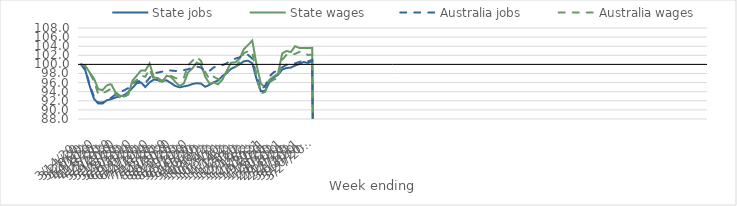
| Category | State jobs | State wages | Australia jobs | Australia wages |
|---|---|---|---|---|
| 14/03/2020 | 100 | 100 | 100 | 100 |
| 21/03/2020 | 98.646 | 99.646 | 98.97 | 99.607 |
| 28/03/2020 | 95.226 | 98.221 | 95.464 | 98.117 |
| 04/04/2020 | 92.442 | 96.905 | 92.906 | 96.324 |
| 11/04/2020 | 91.396 | 94.565 | 91.634 | 93.472 |
| 18/04/2020 | 91.4 | 94.348 | 91.618 | 93.672 |
| 25/04/2020 | 92.123 | 95.401 | 92.147 | 94.096 |
| 02/05/2020 | 92.346 | 95.692 | 92.646 | 94.684 |
| 09/05/2020 | 92.721 | 93.885 | 93.336 | 93.578 |
| 16/05/2020 | 92.961 | 93.185 | 93.928 | 92.809 |
| 23/05/2020 | 93.218 | 92.932 | 94.284 | 92.46 |
| 30/05/2020 | 93.884 | 93.326 | 94.792 | 93.812 |
| 06/06/2020 | 94.85 | 96.424 | 95.776 | 95.91 |
| 13/06/2020 | 95.883 | 97.529 | 96.277 | 96.583 |
| 20/06/2020 | 96.018 | 98.668 | 96.294 | 97.554 |
| 27/06/2020 | 95.026 | 98.626 | 95.892 | 97.289 |
| 04/07/2020 | 96.048 | 100.192 | 97.055 | 98.973 |
| 11/07/2020 | 96.675 | 97.139 | 98.106 | 96.533 |
| 18/07/2020 | 96.54 | 96.984 | 98.208 | 96.372 |
| 25/07/2020 | 96.447 | 96.23 | 98.434 | 96.181 |
| 01/08/2020 | 96.493 | 97.511 | 98.654 | 97.055 |
| 08/08/2020 | 95.88 | 97.249 | 98.656 | 97.48 |
| 15/08/2020 | 95.266 | 96.185 | 98.564 | 96.991 |
| 22/08/2020 | 94.952 | 95.255 | 98.619 | 96.84 |
| 29/08/2020 | 95.161 | 95.826 | 98.754 | 97.076 |
| 05/09/2020 | 95.349 | 98.261 | 98.928 | 99.803 |
| 12/09/2020 | 95.695 | 99.114 | 99.342 | 100.783 |
| 19/09/2020 | 95.858 | 100.399 | 99.517 | 101.637 |
| 26/09/2020 | 95.786 | 99.978 | 99.31 | 100.779 |
| 03/10/2020 | 95.082 | 97.278 | 98.488 | 98.325 |
| 10/10/2020 | 95.518 | 95.797 | 98.579 | 96.712 |
| 17/10/2020 | 96.085 | 96.012 | 99.343 | 97.299 |
| 24/10/2020 | 96.448 | 95.63 | 99.616 | 96.732 |
| 31/10/2020 | 97.436 | 96.628 | 99.832 | 96.893 |
| 07/11/2020 | 98.059 | 98.533 | 100.231 | 98.252 |
| 14/11/2020 | 99.012 | 100.371 | 100.956 | 99.261 |
| 21/11/2020 | 99.454 | 100.44 | 101.258 | 99.291 |
| 28/11/2020 | 100.02 | 101.209 | 101.546 | 100.638 |
| 05/12/2020 | 100.67 | 103.29 | 102.06 | 102.456 |
| 12/12/2020 | 100.814 | 104.276 | 102.096 | 102.885 |
| 19/12/2020 | 100.254 | 105.232 | 101.265 | 102.743 |
| 26/12/2020 | 96.791 | 99.896 | 97.433 | 97.212 |
| 02/01/2021 | 94.092 | 95.769 | 94.376 | 93.531 |
| 09/01/2021 | 94.191 | 95.015 | 95.285 | 93.978 |
| 16/01/2021 | 96.085 | 96.646 | 97.349 | 96.028 |
| 23/01/2021 | 97.135 | 97.341 | 98.277 | 96.664 |
| 30/01/2021 | 97.692 | 97.909 | 98.681 | 96.928 |
| 06/02/2021 | 98.873 | 102.41 | 99.348 | 101.023 |
| 13/02/2021 | 99.202 | 102.949 | 99.928 | 102.099 |
| 20/02/2021 | 99.294 | 102.702 | 99.969 | 102.073 |
| 27/02/2021 | 99.744 | 104 | 100.21 | 102.312 |
| 06/03/2021 | 100.092 | 103.626 | 100.53 | 102.759 |
| 13/03/2021 | 100.518 | 103.625 | 100.859 | 102.584 |
| 20/03/2021 | 100.328 | 103.576 | 100.674 | 102.081 |
| 27/03/2021 | 100.645 | 103.648 | 100.974 | 102.126 |